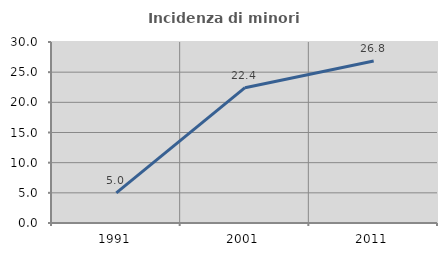
| Category | Incidenza di minori stranieri |
|---|---|
| 1991.0 | 5 |
| 2001.0 | 22.43 |
| 2011.0 | 26.842 |